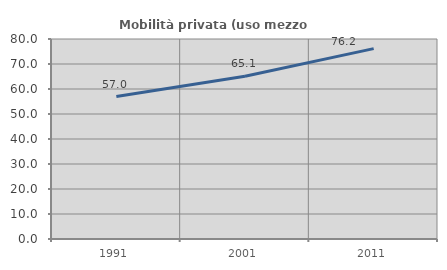
| Category | Mobilità privata (uso mezzo privato) |
|---|---|
| 1991.0 | 56.964 |
| 2001.0 | 65.066 |
| 2011.0 | 76.154 |